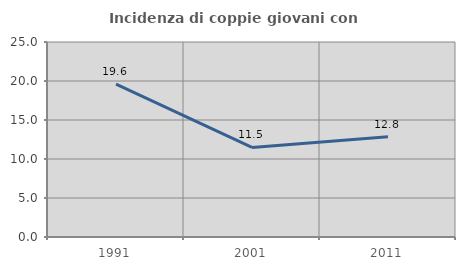
| Category | Incidenza di coppie giovani con figli |
|---|---|
| 1991.0 | 19.592 |
| 2001.0 | 11.483 |
| 2011.0 | 12.849 |